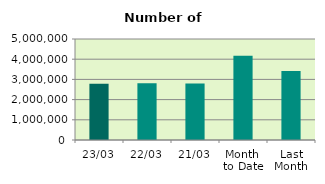
| Category | Series 0 |
|---|---|
| 23/03 | 2788872 |
| 22/03 | 2812288 |
| 21/03 | 2801728 |
| Month 
to Date | 4175822.471 |
| Last
Month | 3413232.3 |